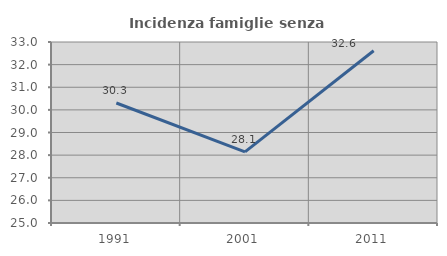
| Category | Incidenza famiglie senza nuclei |
|---|---|
| 1991.0 | 30.305 |
| 2001.0 | 28.146 |
| 2011.0 | 32.613 |